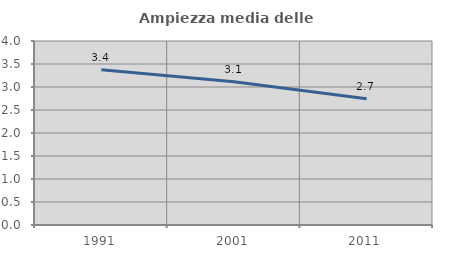
| Category | Ampiezza media delle famiglie |
|---|---|
| 1991.0 | 3.374 |
| 2001.0 | 3.113 |
| 2011.0 | 2.743 |